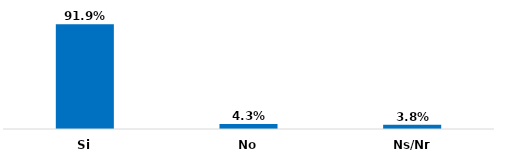
| Category | Series 0 |
|---|---|
| Si | 0.919 |
| No | 0.043 |
| Ns/Nr | 0.038 |